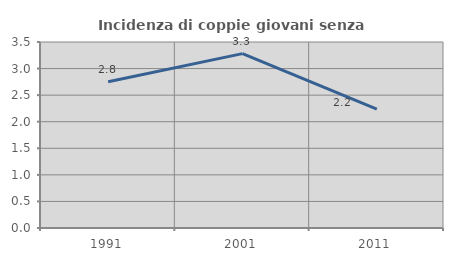
| Category | Incidenza di coppie giovani senza figli |
|---|---|
| 1991.0 | 2.751 |
| 2001.0 | 3.281 |
| 2011.0 | 2.238 |